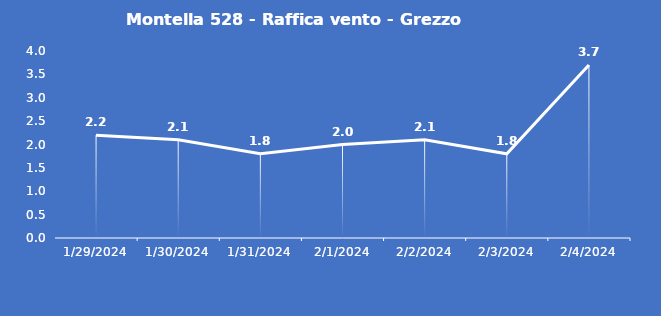
| Category | Montella 528 - Raffica vento - Grezzo (m/s) |
|---|---|
| 1/29/24 | 2.2 |
| 1/30/24 | 2.1 |
| 1/31/24 | 1.8 |
| 2/1/24 | 2 |
| 2/2/24 | 2.1 |
| 2/3/24 | 1.8 |
| 2/4/24 | 3.7 |